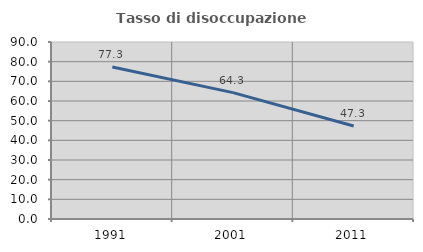
| Category | Tasso di disoccupazione giovanile  |
|---|---|
| 1991.0 | 77.277 |
| 2001.0 | 64.274 |
| 2011.0 | 47.297 |